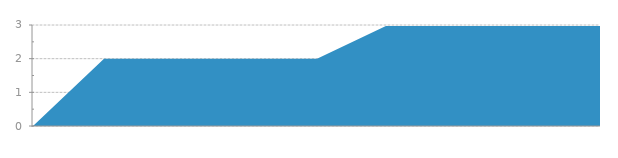
| Category | Series 0 |
|---|---|
| 0 | 0 |
| 1 | 2 |
| 2 | 2 |
| 3 | 2 |
| 4 | 2 |
| 5 | 3 |
| 6 | 3 |
| 7 | 3 |
| 8 | 3 |